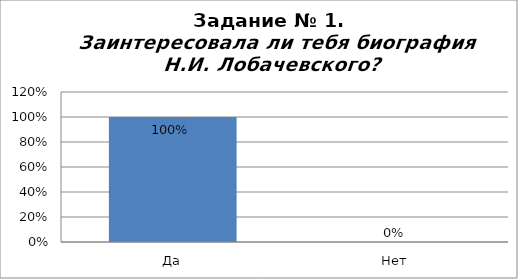
| Category | Заинтересовала ли тебя биография Н.И. Лобачевского? |
|---|---|
| Да | 1 |
| Нет | 0 |